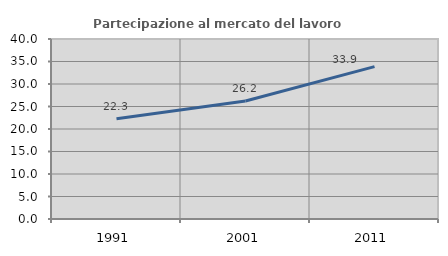
| Category | Partecipazione al mercato del lavoro  femminile |
|---|---|
| 1991.0 | 22.264 |
| 2001.0 | 26.23 |
| 2011.0 | 33.865 |